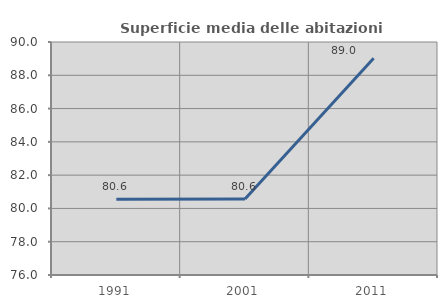
| Category | Superficie media delle abitazioni occupate |
|---|---|
| 1991.0 | 80.555 |
| 2001.0 | 80.569 |
| 2011.0 | 89.022 |